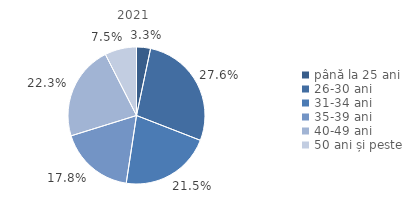
| Category | 2021 |
|---|---|
| până la 25 ani | 3.3 |
| 26-30 ani | 27.6 |
| 31-34 ani | 21.5 |
| 35-39 ani | 17.8 |
| 40-49 ani | 22.3 |
| 50 ani și peste | 7.5 |